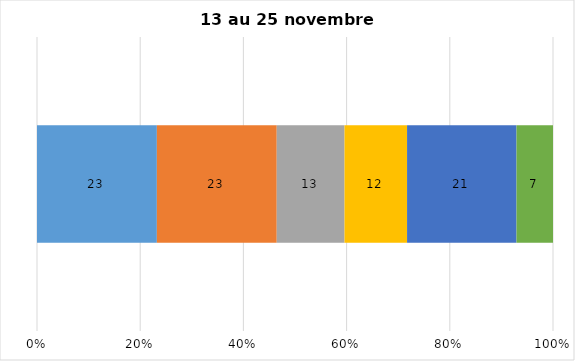
| Category | Plusieurs fois par jour | Une fois par jour | Quelques fois par semaine   | Une fois par semaine ou moins   |  Jamais   |  Je n’utilise pas les médias sociaux |
|---|---|---|---|---|---|---|
| 0 | 23 | 23 | 13 | 12 | 21 | 7 |